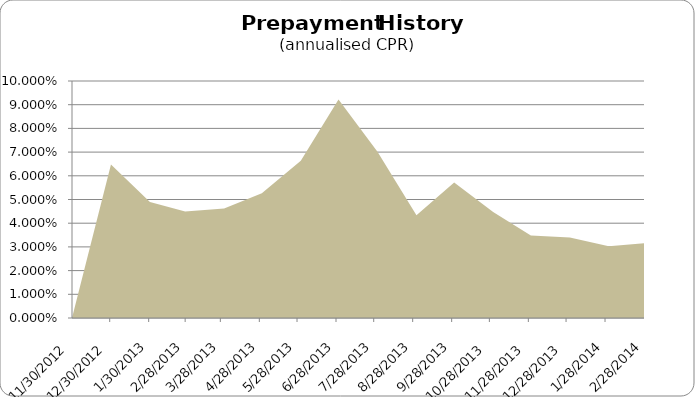
| Category | CPR |
|---|---|
| 11/30/12 | 0 |
| 12/31/12 | 0.065 |
| 1/31/13 | 0.049 |
| 2/28/13 | 0.045 |
| 3/31/13 | 0.046 |
| 4/30/13 | 0.053 |
| 5/31/13 | 0.066 |
| 6/30/13 | 0.092 |
| 7/31/13 | 0.07 |
| 8/31/13 | 0.043 |
| 9/30/13 | 0.057 |
| 10/31/13 | 0.045 |
| 11/30/13 | 0.035 |
| 12/31/13 | 0.034 |
| 1/31/14 | 0.03 |
| 2/28/14 | 0.032 |